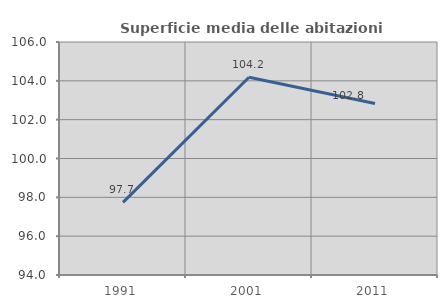
| Category | Superficie media delle abitazioni occupate |
|---|---|
| 1991.0 | 97.74 |
| 2001.0 | 104.187 |
| 2011.0 | 102.837 |